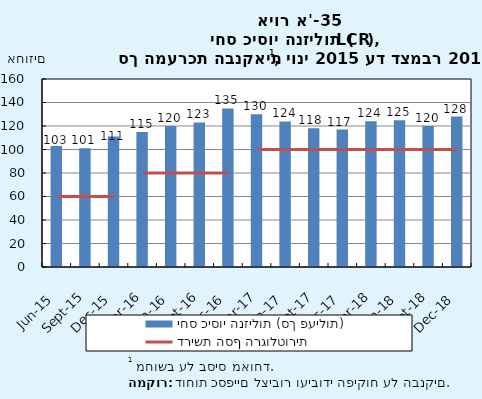
| Category | יחס כיסוי הנזילות (סך פעילות) |
|---|---|
| 2015-06-30 | 103 |
| 2015-09-30 | 101 |
| 2015-12-31 | 111 |
| 2016-03-31 | 115 |
| 2016-06-30 | 120 |
| 2016-09-30 | 123 |
| 2016-12-31 | 135 |
| 2017-03-31 | 130 |
| 2017-06-30 | 123.919 |
| 2017-09-30 | 118 |
| 2017-12-31 | 117 |
| 2018-03-31 | 124 |
| 2018-06-30 | 125 |
| 2018-09-30 | 120 |
| 2018-12-31 | 128 |